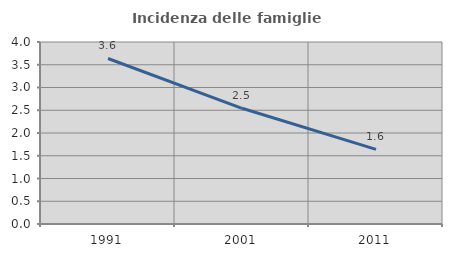
| Category | Incidenza delle famiglie numerose |
|---|---|
| 1991.0 | 3.638 |
| 2001.0 | 2.543 |
| 2011.0 | 1.641 |